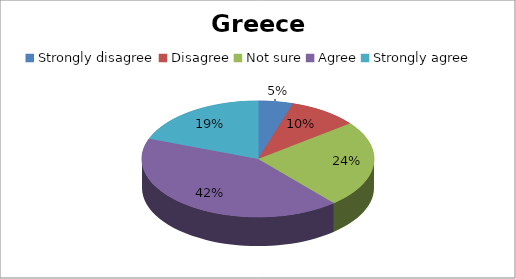
| Category | Series 0 |
|---|---|
| Strongly disagree | 3 |
| Disagree | 6 |
| Not sure | 15 |
| Agree | 26 |
| Strongly agree | 12 |